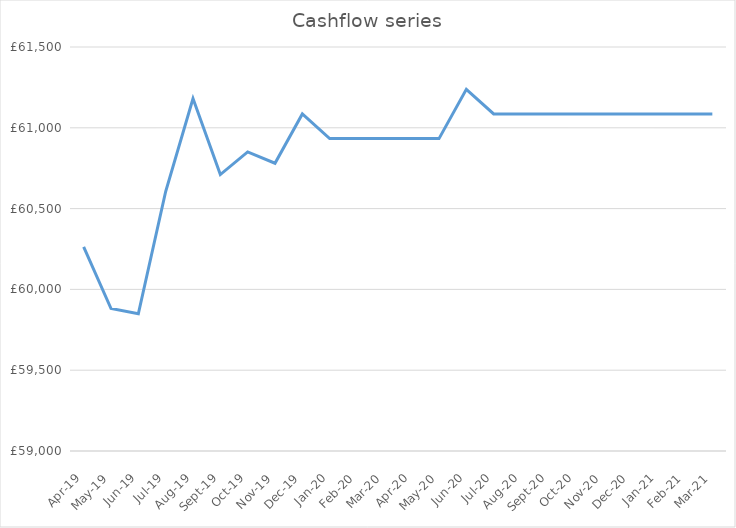
| Category | Series 0 |
|---|---|
| 2019-04-01 | 60262.743 |
| 2019-05-01 | 59881.84 |
| 2019-06-01 | 59848.776 |
| 2019-07-01 | 60605.676 |
| 2019-08-01 | 61180.909 |
| 2019-09-01 | 60710.589 |
| 2019-10-01 | 60850.589 |
| 2019-11-01 | 60780.589 |
| 2019-12-01 | 61085.589 |
| 2020-01-01 | 60933.089 |
| 2020-02-01 | 60933.089 |
| 2020-03-01 | 60933.089 |
| 2020-04-01 | 60933.089 |
| 2020-05-01 | 60933.089 |
| 2020-06-01 | 61238.089 |
| 2020-07-01 | 61085.589 |
| 2020-08-01 | 61085.589 |
| 2020-09-01 | 61085.589 |
| 2020-10-01 | 61085.589 |
| 2020-11-01 | 61085.589 |
| 2020-12-01 | 61085.589 |
| 2021-01-01 | 61085.589 |
| 2021-02-01 | 61085.589 |
| 2021-03-01 | 61085.589 |